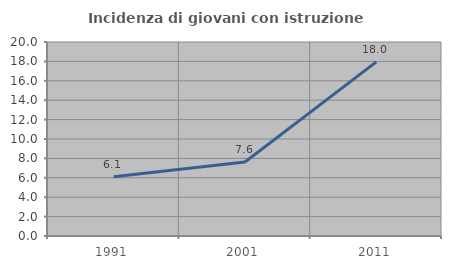
| Category | Incidenza di giovani con istruzione universitaria |
|---|---|
| 1991.0 | 6.116 |
| 2001.0 | 7.624 |
| 2011.0 | 17.954 |